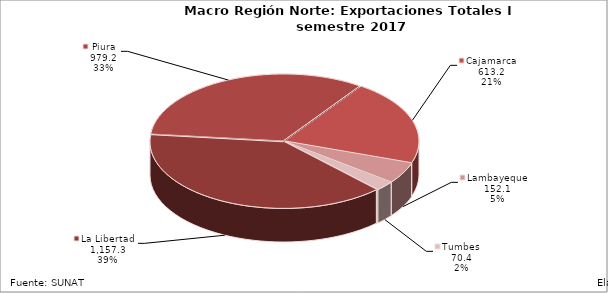
| Category | Series 0 |
|---|---|
| La Libertad | 1157.311 |
| Piura | 979.157 |
| Cajamarca | 613.225 |
| Lambayeque | 152.141 |
| Tumbes | 70.41 |